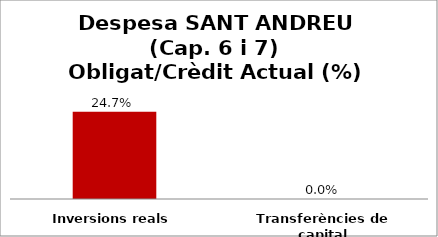
| Category | Series 0 |
|---|---|
| Inversions reals | 0.247 |
| Transferències de capital | 0 |